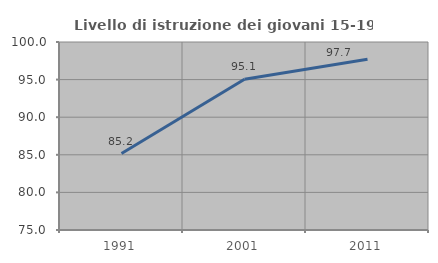
| Category | Livello di istruzione dei giovani 15-19 anni |
|---|---|
| 1991.0 | 85.166 |
| 2001.0 | 95.053 |
| 2011.0 | 97.717 |